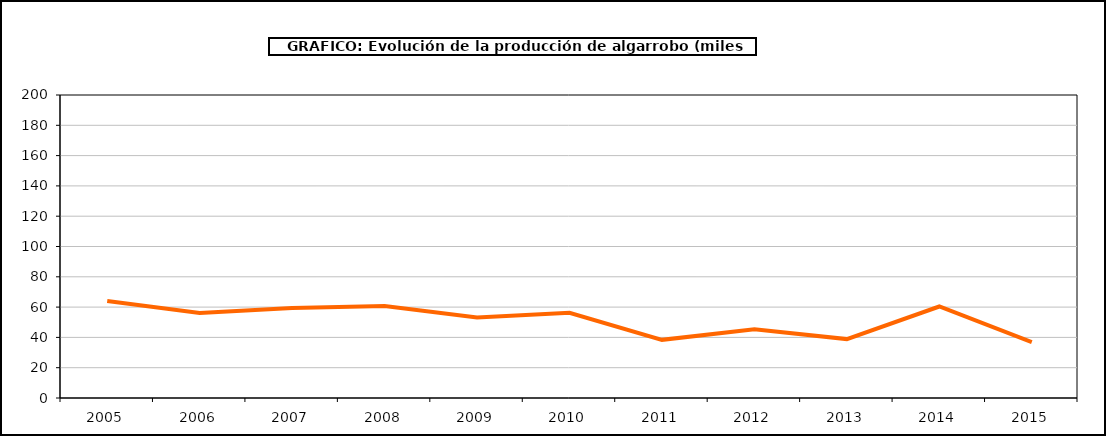
| Category | producción |
|---|---|
| 2005.0 | 64.067 |
| 2006.0 | 56.081 |
| 2007.0 | 59.449 |
| 2008.0 | 60.795 |
| 2009.0 | 53.202 |
| 2010.0 | 56.286 |
| 2011.0 | 38.38 |
| 2012.0 | 45.414 |
| 2013.0 | 38.882 |
| 2014.0 | 60.4 |
| 2015.0 | 36.894 |